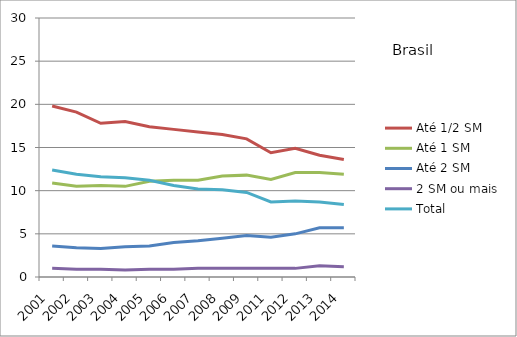
| Category | Até 1/2 SM | Até 1 SM | Até 2 SM | 2 SM ou mais | Total |
|---|---|---|---|---|---|
| 2001.0 | 19.8 | 10.9 | 3.6 | 1 | 12.4 |
| 2002.0 | 19.1 | 10.5 | 3.4 | 0.9 | 11.9 |
| 2003.0 | 17.8 | 10.6 | 3.3 | 0.9 | 11.6 |
| 2004.0 | 18 | 10.5 | 3.5 | 0.8 | 11.5 |
| 2005.0 | 17.4 | 11.1 | 3.6 | 0.9 | 11.2 |
| 2006.0 | 17.1 | 11.2 | 4 | 0.9 | 10.6 |
| 2007.0 | 16.8 | 11.2 | 4.2 | 1 | 10.2 |
| 2008.0 | 16.5 | 11.7 | 4.5 | 1 | 10.1 |
| 2009.0 | 16 | 11.8 | 4.8 | 1 | 9.8 |
| 2011.0 | 14.4 | 11.3 | 4.6 | 1 | 8.7 |
| 2012.0 | 14.9 | 12.1 | 5 | 1 | 8.8 |
| 2013.0 | 14.1 | 12.1 | 5.7 | 1.3 | 8.7 |
| 2014.0 | 13.6 | 11.9 | 5.7 | 1.2 | 8.4 |